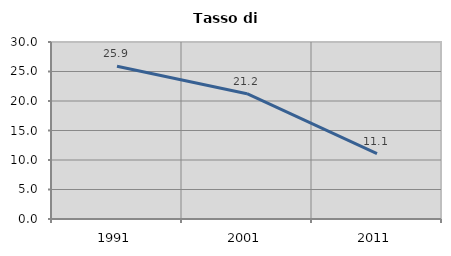
| Category | Tasso di disoccupazione   |
|---|---|
| 1991.0 | 25.904 |
| 2001.0 | 21.241 |
| 2011.0 | 11.085 |